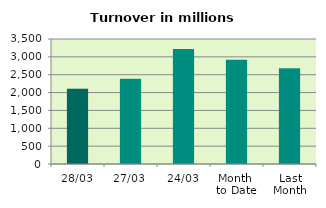
| Category | Series 0 |
|---|---|
| 28/03 | 2109.497 |
| 27/03 | 2386.874 |
| 24/03 | 3220.282 |
| Month 
to Date | 2915.607 |
| Last
Month | 2679.99 |